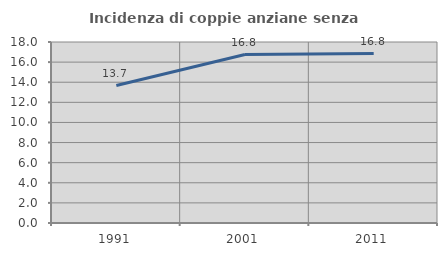
| Category | Incidenza di coppie anziane senza figli  |
|---|---|
| 1991.0 | 13.67 |
| 2001.0 | 16.753 |
| 2011.0 | 16.849 |